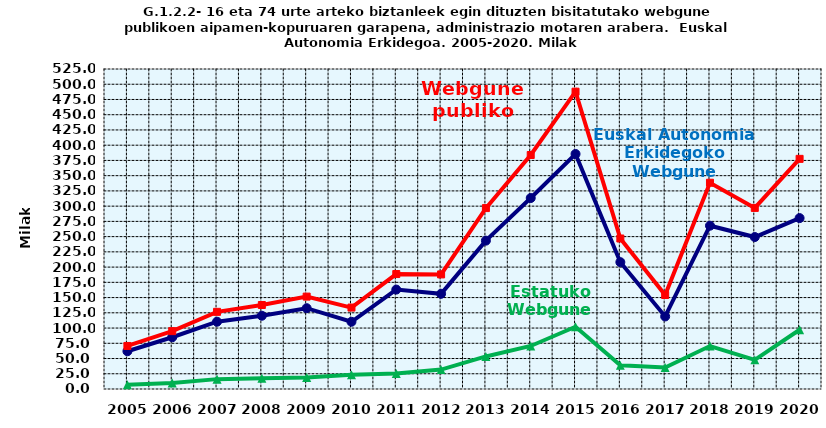
| Category | Euskal Autonomia Erkidegoko Webgune publikoak | Estatuko Webgune publikoak | Webgune publiko guztira |
|---|---|---|---|
| 2005.0 | 61.9 | 7 | 70.6 |
| 2006.0 | 84.9 | 10 | 94.9 |
| 2007.0 | 110.4 | 16.2 | 126.6 |
| 2008.0 | 120.2 | 17.6 | 137.8 |
| 2009.0 | 132.6 | 19 | 151.6 |
| 2010.0 | 110.3 | 23.3 | 133.6 |
| 2011.0 | 163.1 | 25.5 | 188.6 |
| 2012.0 | 156.2 | 31.8 | 188 |
| 2013.0 | 243.4 | 53.4 | 296.8 |
| 2014.0 | 313.3 | 70.6 | 383.9 |
| 2015.0 | 385.6 | 102.2 | 487.8 |
| 2016.0 | 208.1 | 38.8 | 246.9 |
| 2017.0 | 119 | 35.2 | 154.2 |
| 2018.0 | 267.9 | 70.5 | 338.4 |
| 2019.0 | 249.3 | 47.8 | 297.1 |
| 2020.0 | 280.4 | 97.2 | 377.6 |